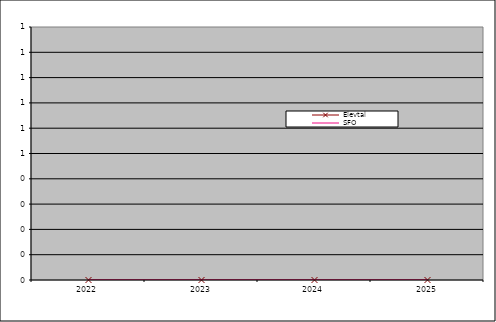
| Category | Elevtal | SFO |
|---|---|---|
| 2022.0 | 0 | 0 |
| 2023.0 | 0 | 0 |
| 2024.0 | 0 | 0 |
| 2025.0 | 0 | 0 |